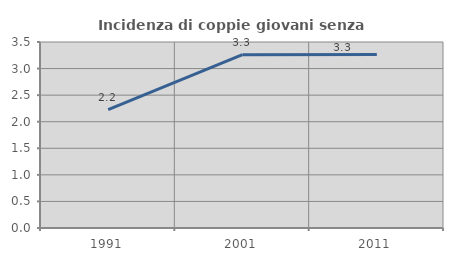
| Category | Incidenza di coppie giovani senza figli |
|---|---|
| 1991.0 | 2.229 |
| 2001.0 | 3.261 |
| 2011.0 | 3.265 |